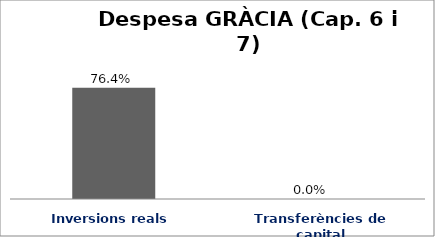
| Category | Series 0 |
|---|---|
| Inversions reals | 0.764 |
| Transferències de capital | 0 |